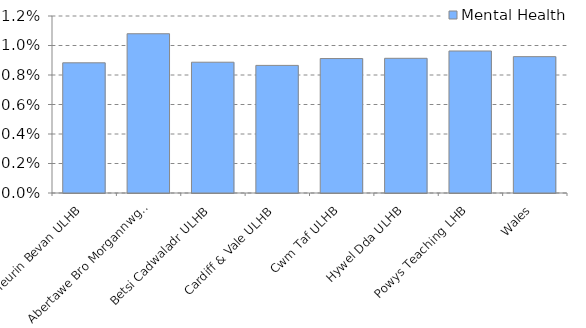
| Category | Mental Health |
|---|---|
| Aneurin Bevan ULHB | 0.009 |
| Abertawe Bro Morgannwg ULHB | 0.011 |
| Betsi Cadwaladr ULHB | 0.009 |
| Cardiff & Vale ULHB | 0.009 |
| Cwm Taf ULHB | 0.009 |
| Hywel Dda ULHB | 0.009 |
| Powys Teaching LHB | 0.01 |
| Wales | 0.009 |